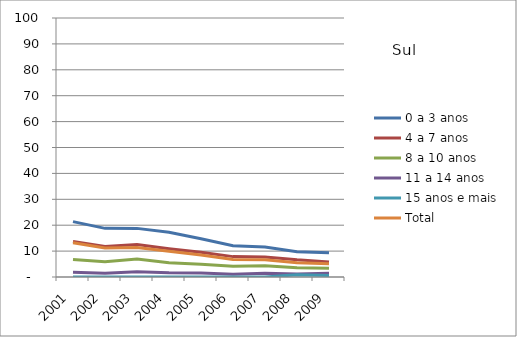
| Category | 0 a 3 anos | 4 a 7 anos | 8 a 10 anos | 11 a 14 anos | 15 anos e mais | Total |
|---|---|---|---|---|---|---|
| 2001.0 | 21.39 | 13.73 | 6.79 | 1.85 | 0 | 13.26 |
| 2002.0 | 18.78 | 11.76 | 5.91 | 1.45 | 0 | 11.18 |
| 2003.0 | 18.77 | 12.51 | 6.96 | 2.03 | 0 | 11.35 |
| 2004.0 | 17.24 | 10.91 | 5.51 | 1.6 | 0 | 9.9 |
| 2005.0 | 14.74 | 9.54 | 4.97 | 1.54 | 0 | 8.5 |
| 2006.0 | 12.07 | 7.87 | 4.19 | 1.04 | 0 | 6.76 |
| 2007.0 | 11.6 | 7.72 | 4.32 | 1.48 | 0 | 6.62 |
| 2008.0 | 9.76 | 6.63 | 3.57 | 1.18 | 0.84 | 5.49 |
| 2009.0 | 9.35 | 5.82 | 3.39 | 1.43 | 0.62 | 5.08 |